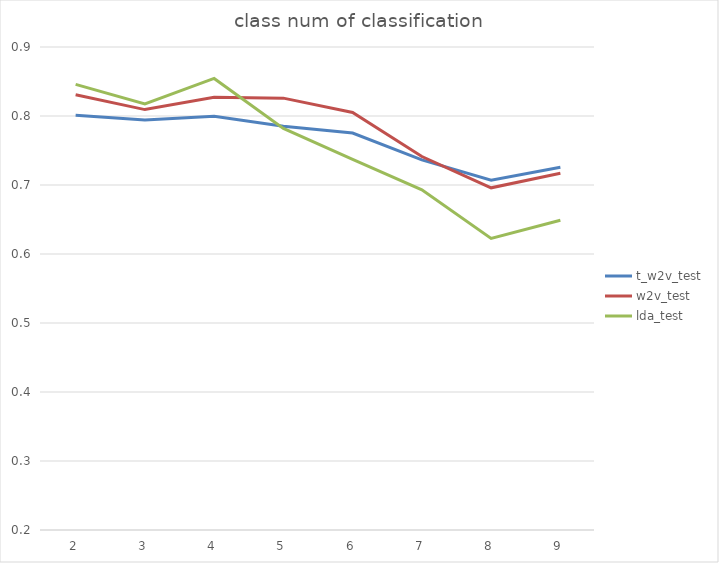
| Category | t_w2v_test | w2v_test | lda_test |
|---|---|---|---|
| 2.0 | 0.801 | 0.831 | 0.846 |
| 3.0 | 0.794 | 0.809 | 0.818 |
| 4.0 | 0.8 | 0.827 | 0.854 |
| 5.0 | 0.785 | 0.826 | 0.782 |
| 6.0 | 0.775 | 0.805 | 0.737 |
| 7.0 | 0.736 | 0.741 | 0.693 |
| 8.0 | 0.707 | 0.696 | 0.623 |
| 9.0 | 0.726 | 0.717 | 0.649 |